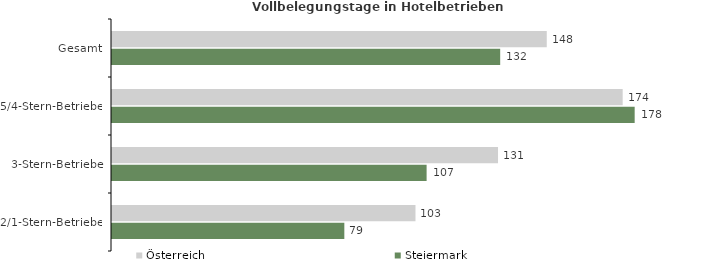
| Category | Österreich | Steiermark |
|---|---|---|
| Gesamt | 147.876 | 132.038 |
| 5/4-Stern-Betriebe | 173.697 | 177.779 |
| 3-Stern-Betriebe | 131.294 | 107.011 |
| 2/1-Stern-Betriebe | 103.222 | 79.024 |